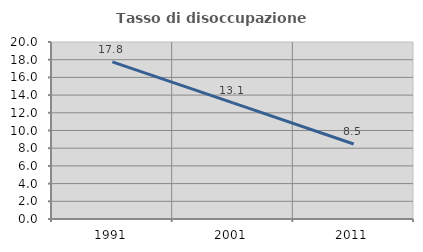
| Category | Tasso di disoccupazione giovanile  |
|---|---|
| 1991.0 | 17.757 |
| 2001.0 | 13.115 |
| 2011.0 | 8.475 |